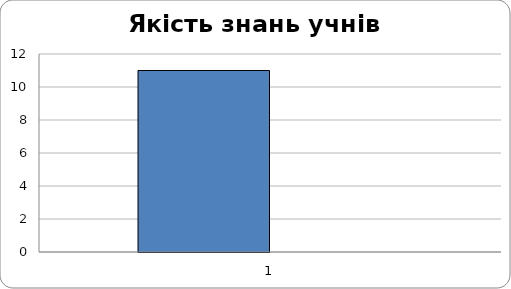
| Category | Series 0 | Series 1 |
|---|---|---|
| 0 | 11 |  |